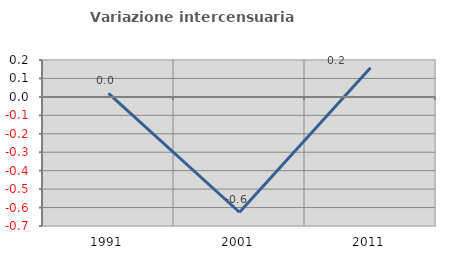
| Category | Variazione intercensuaria annua |
|---|---|
| 1991.0 | 0.019 |
| 2001.0 | -0.625 |
| 2011.0 | 0.158 |